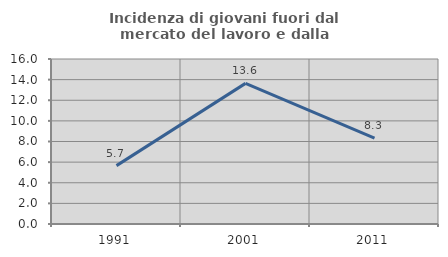
| Category | Incidenza di giovani fuori dal mercato del lavoro e dalla formazione  |
|---|---|
| 1991.0 | 5.66 |
| 2001.0 | 13.636 |
| 2011.0 | 8.333 |